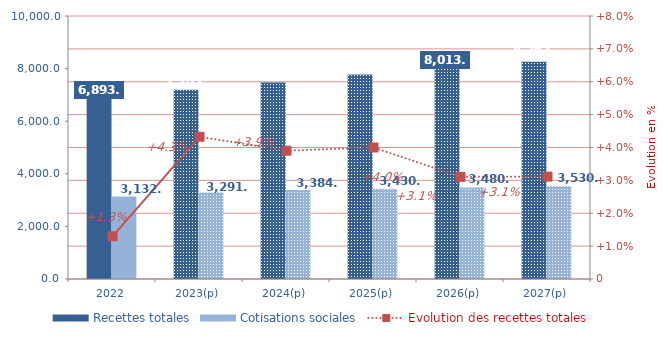
| Category | Recettes totales | Cotisations sociales |
|---|---|---|
| 2022 | 6893.747 | 3132.416 |
| 2023(p) | 7191.954 | 3291.272 |
| 2024(p) | 7472.666 | 3384.892 |
| 2025(p) | 7771.539 | 3430.195 |
| 2026(p) | 8013.131 | 3480.258 |
| 2027(p) | 8262.744 | 3530.431 |